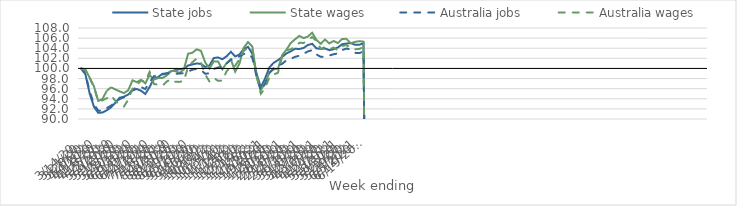
| Category | State jobs | State wages | Australia jobs | Australia wages |
|---|---|---|---|---|
| 14/03/2020 | 100 | 100 | 100 | 100 |
| 21/03/2020 | 98.84 | 99.813 | 98.971 | 99.604 |
| 28/03/2020 | 95.02 | 98.153 | 95.467 | 98.106 |
| 04/04/2020 | 92.407 | 96.44 | 92.922 | 96.239 |
| 11/04/2020 | 91.211 | 93.554 | 91.648 | 93.488 |
| 18/04/2020 | 91.295 | 94.001 | 91.632 | 93.693 |
| 25/04/2020 | 91.723 | 95.59 | 92.163 | 94.114 |
| 02/05/2020 | 92.312 | 96.277 | 92.661 | 94.661 |
| 09/05/2020 | 93.218 | 95.84 | 93.345 | 93.586 |
| 16/05/2020 | 94.213 | 95.471 | 93.938 | 92.82 |
| 23/05/2020 | 94.408 | 95.126 | 94.296 | 92.472 |
| 30/05/2020 | 94.834 | 95.688 | 94.804 | 93.802 |
| 06/06/2020 | 95.634 | 97.65 | 95.79 | 95.983 |
| 13/06/2020 | 95.941 | 97.298 | 96.291 | 96.659 |
| 20/06/2020 | 95.588 | 97.742 | 96.307 | 97.626 |
| 27/06/2020 | 94.945 | 97.047 | 95.924 | 97.398 |
| 04/07/2020 | 96.328 | 98.7 | 97.286 | 99.305 |
| 11/07/2020 | 97.968 | 97.801 | 98.453 | 96.936 |
| 18/07/2020 | 98.298 | 98.092 | 98.574 | 96.771 |
| 25/07/2020 | 98.951 | 98.113 | 98.8 | 96.557 |
| 01/08/2020 | 98.994 | 98.619 | 99.036 | 97.398 |
| 08/08/2020 | 99.408 | 99.485 | 99.039 | 97.865 |
| 15/08/2020 | 99.682 | 99.472 | 98.915 | 97.373 |
| 22/08/2020 | 99.847 | 99.11 | 99.01 | 97.336 |
| 29/08/2020 | 99.953 | 99.789 | 99.05 | 97.544 |
| 05/09/2020 | 100.583 | 102.904 | 99.381 | 100.291 |
| 12/09/2020 | 100.795 | 103.106 | 99.754 | 101.228 |
| 19/09/2020 | 100.989 | 103.784 | 99.918 | 101.971 |
| 26/09/2020 | 100.895 | 103.486 | 99.725 | 101.154 |
| 03/10/2020 | 100.298 | 101.193 | 98.937 | 98.795 |
| 10/10/2020 | 100.59 | 99.97 | 99.064 | 97.403 |
| 17/10/2020 | 102.06 | 101.405 | 99.896 | 98.12 |
| 24/10/2020 | 102.181 | 101.376 | 100.185 | 97.546 |
| 31/10/2020 | 101.821 | 99.829 | 100.363 | 97.615 |
| 07/11/2020 | 102.404 | 101.076 | 100.966 | 99.446 |
| 14/11/2020 | 103.298 | 101.799 | 101.741 | 100.424 |
| 21/11/2020 | 102.371 | 99.364 | 102.085 | 100.522 |
| 28/11/2020 | 102.754 | 100.96 | 102.383 | 101.813 |
| 05/12/2020 | 103.852 | 104.109 | 102.872 | 103.509 |
| 12/12/2020 | 104.271 | 105.209 | 102.957 | 104.014 |
| 19/12/2020 | 102.921 | 104.357 | 102.168 | 103.915 |
| 26/12/2020 | 98.961 | 98.473 | 98.391 | 98.452 |
| 02/01/2021 | 96.256 | 95.766 | 95.58 | 95.006 |
| 09/01/2021 | 98.046 | 97.052 | 96.988 | 96.148 |
| 16/01/2021 | 100.214 | 99.198 | 99.101 | 98.251 |
| 23/01/2021 | 101.116 | 99.833 | 100.068 | 98.817 |
| 30/01/2021 | 101.643 | 99.95 | 100.556 | 99.148 |
| 06/02/2021 | 102.28 | 102.657 | 100.923 | 102.467 |
| 13/02/2021 | 102.989 | 103.72 | 101.643 | 103.619 |
| 20/02/2021 | 103.391 | 105.04 | 101.902 | 103.78 |
| 27/02/2021 | 103.9 | 105.77 | 102.3 | 104.333 |
| 06/03/2021 | 103.839 | 106.435 | 102.521 | 105.064 |
| 13/03/2021 | 104.059 | 106 | 102.877 | 105.052 |
| 20/03/2021 | 104.634 | 106.308 | 103.384 | 105.539 |
| 27/03/2021 | 104.873 | 107.07 | 103.612 | 106.245 |
| 03/04/2021 | 103.968 | 105.635 | 102.769 | 105.395 |
| 10/04/2021 | 103.861 | 104.866 | 102.293 | 103.884 |
| 17/04/2021 | 103.949 | 105.724 | 102.308 | 104.211 |
| 24/04/2021 | 103.614 | 104.951 | 102.558 | 103.772 |
| 01/05/2021 | 103.802 | 105.43 | 102.806 | 104.122 |
| 08/05/2021 | 104.162 | 105.022 | 102.974 | 103.594 |
| 15/05/2021 | 104.789 | 105.845 | 103.642 | 104.439 |
| 22/05/2021 | 104.925 | 105.851 | 103.934 | 104.625 |
| 29/05/2021 | 105.016 | 104.993 | 103.744 | 104.038 |
| 05/06/2021 | 104.683 | 105.249 | 103.091 | 103.805 |
| 12/06/2021 | 104.686 | 105.398 | 103.033 | 103.851 |
| 19/06/2021 | 104.988 | 105.302 | 103.366 | 104.254 |